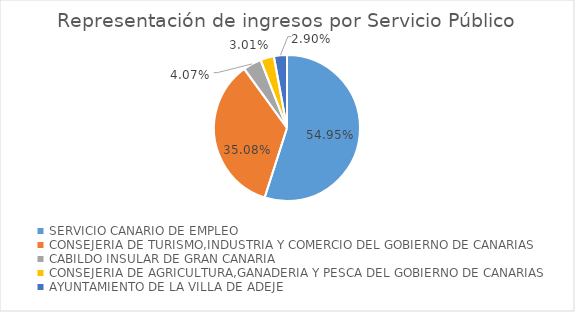
| Category | PORCENTAJE |
|---|---|
| SERVICIO CANARIO DE EMPLEO | 0.549 |
| CONSEJERIA DE TURISMO,INDUSTRIA Y COMERCIO DEL GOBIERNO DE CANARIAS | 0.351 |
| CABILDO INSULAR DE GRAN CANARIA | 0.041 |
| CONSEJERIA DE AGRICULTURA,GANADERIA Y PESCA DEL GOBIERNO DE CANARIAS | 0.03 |
| AYUNTAMIENTO DE LA VILLA DE ADEJE | 0.029 |